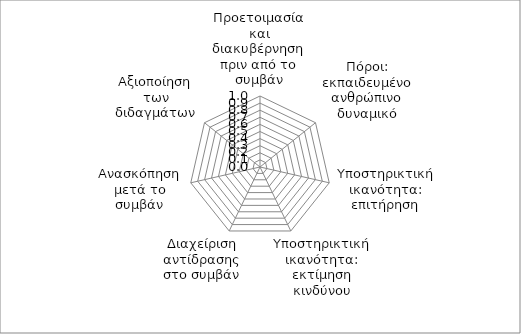
| Category | Series 0 |
|---|---|
| Προετοιμασία και διακυβέρνηση πριν από το συμβάν | 0 |
| Πόροι: εκπαιδευμένο ανθρώπινο δυναμικό | 0 |
| Υποστηρικτική ικανότητα: επιτήρηση | 0 |
| Υποστηρικτική ικανότητα: εκτίμηση κινδύνου | 0 |
| Διαχείριση αντίδρασης στο συμβάν | 0 |
| Ανασκόπηση μετά το συμβάν | 0 |
| Αξιοποίηση των διδαγμάτων | 0 |